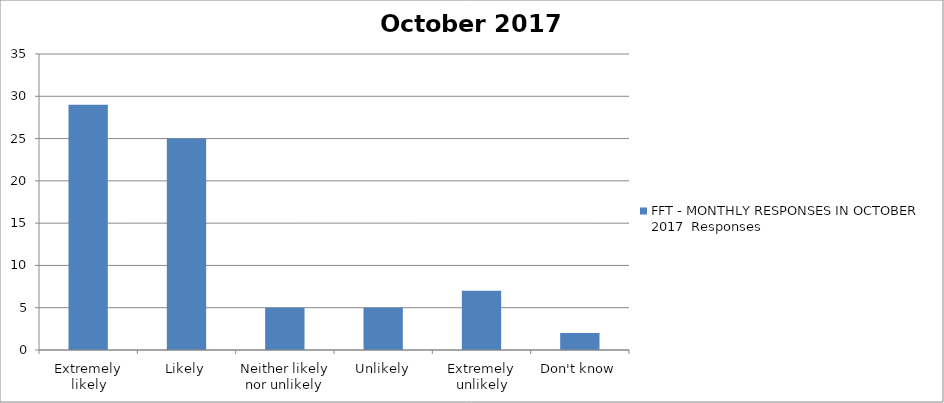
| Category | FFT - MONTHLY RESPONSES IN OCTOBER 2017 |
|---|---|
| Extremely likely | 29 |
| Likely | 25 |
| Neither likely nor unlikely | 5 |
| Unlikely | 5 |
| Extremely unlikely | 7 |
| Don't know | 2 |